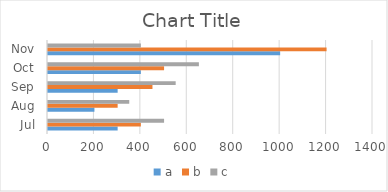
| Category | a | b | c |
|---|---|---|---|
| Jul | 300 | 400 | 500 |
| Aug | 200 | 300 | 350 |
| Sep | 300 | 450 | 550 |
| Oct | 400 | 500 | 650 |
| Nov | 1000 | 1200 | 400 |